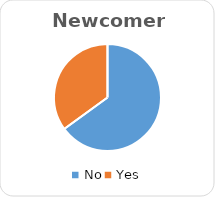
| Category | Newcomers |
|---|---|
| No | 39 |
| Yes | 21 |